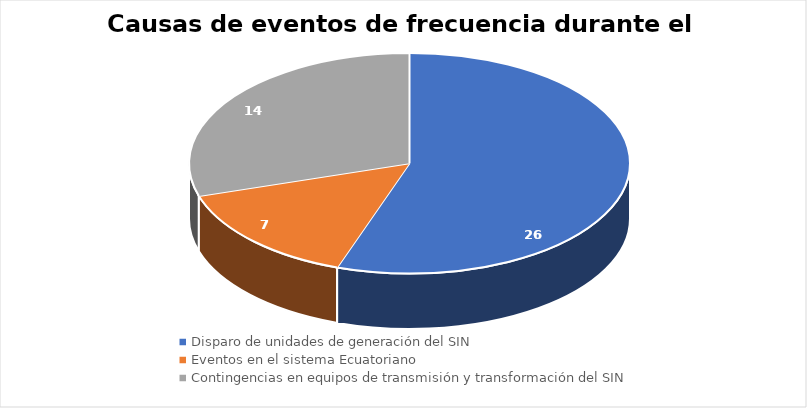
| Category | Series 0 |
|---|---|
| Disparo de unidades de generación del SIN | 26 |
| Eventos en el sistema Ecuatoriano | 7 |
| Contingencias en equipos de transmisión y transformación del SIN | 14 |